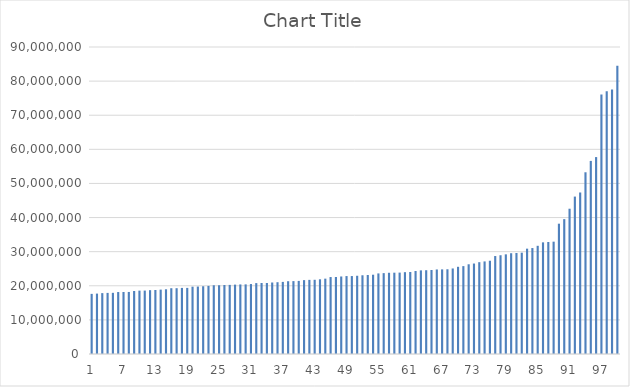
| Category | Series 0 |
|---|---|
| 0 | 17626939 |
| 1 | 17708144 |
| 2 | 17849343 |
| 3 | 17910371 |
| 4 | 17932895 |
| 5 | 18166006 |
| 6 | 18177410 |
| 7 | 18188947 |
| 8 | 18475033 |
| 9 | 18575698 |
| 10 | 18591959 |
| 11 | 18712721 |
| 12 | 18771205 |
| 13 | 18871875 |
| 14 | 18973722 |
| 15 | 19287983 |
| 16 | 19294429 |
| 17 | 19379257 |
| 18 | 19379768 |
| 19 | 19740023 |
| 20 | 19772130 |
| 21 | 19863873 |
| 22 | 19968321 |
| 23 | 20154012 |
| 24 | 20157821 |
| 25 | 20228249 |
| 26 | 20259761 |
| 27 | 20337868 |
| 28 | 20392521 |
| 29 | 20415060 |
| 30 | 20508490 |
| 31 | 20783301 |
| 32 | 20815290 |
| 33 | 20816289 |
| 34 | 20960569 |
| 35 | 21044952 |
| 36 | 21138133 |
| 37 | 21337757 |
| 38 | 21370201 |
| 39 | 21428765 |
| 40 | 21656906 |
| 41 | 21733013 |
| 42 | 21756257 |
| 43 | 21897820 |
| 44 | 22086161 |
| 45 | 22562466 |
| 46 | 22572279 |
| 47 | 22725275 |
| 48 | 22849054 |
| 49 | 22849412 |
| 50 | 22935936 |
| 51 | 23079110 |
| 52 | 23153471 |
| 53 | 23244908 |
| 54 | 23625000 |
| 55 | 23709094 |
| 56 | 23813815 |
| 57 | 23839294 |
| 58 | 23863744 |
| 59 | 23989883 |
| 60 | 24046719 |
| 61 | 24328710 |
| 62 | 24519320 |
| 63 | 24559899 |
| 64 | 24633641 |
| 65 | 24782017 |
| 66 | 24805965 |
| 67 | 24840351 |
| 68 | 25076513 |
| 69 | 25564283 |
| 70 | 25761432 |
| 71 | 26303071 |
| 72 | 26520515 |
| 73 | 26918489 |
| 74 | 27141924 |
| 75 | 27341628 |
| 76 | 28720491 |
| 77 | 28952558 |
| 78 | 29216536 |
| 79 | 29545272 |
| 80 | 29617964 |
| 81 | 29701175 |
| 82 | 30879812 |
| 83 | 31058959 |
| 84 | 31718608 |
| 85 | 32730259 |
| 86 | 32833583 |
| 87 | 32932618 |
| 88 | 38201047 |
| 89 | 39535534 |
| 90 | 42589296 |
| 91 | 46149360 |
| 92 | 47349121 |
| 93 | 53275790 |
| 94 | 56608736 |
| 95 | 57729020 |
| 96 | 76107010 |
| 97 | 77061964 |
| 98 | 77556015 |
| 99 | 84515308 |